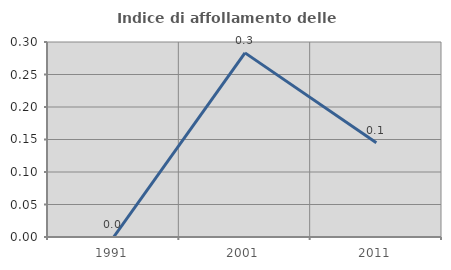
| Category | Indice di affollamento delle abitazioni  |
|---|---|
| 1991.0 | 0 |
| 2001.0 | 0.283 |
| 2011.0 | 0.145 |